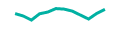
| Category | Series 1 |
|---|---|
| 0 | 0.67 |
| 1 | 0.55 |
| 2 | 0.346 |
| 3 | 0.661 |
| 4 | 0.747 |
| 5 | 0.921 |
| 6 | 0.894 |
| 7 | 0.796 |
| 8 | 0.597 |
| 9 | 0.399 |
| 10 | 0.679 |
| 11 | 0.883 |